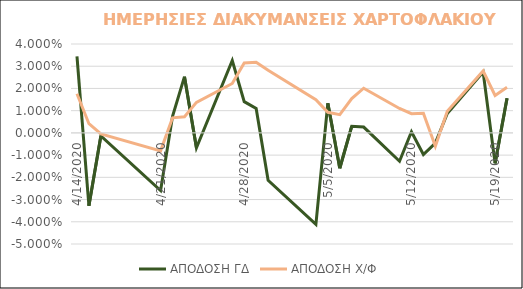
| Category | ΑΠΟΔΟΣΗ ΓΔ | ΑΠΟΔΟΣΗ Χ/Φ |
|---|---|---|
| 4/14/20 | 0.034 | 0.018 |
| 4/15/20 | -0.033 | 0.004 |
| 4/16/20 | -0.001 | 0 |
| 4/21/20 | -0.026 | -0.008 |
| 4/22/20 | 0.007 | 0.007 |
| 4/23/20 | 0.025 | 0.007 |
| 4/24/20 | -0.007 | 0.014 |
| 4/27/20 | 0.033 | 0.022 |
| 4/28/20 | 0.014 | 0.031 |
| 4/29/20 | 0.011 | 0.032 |
| 4/30/20 | -0.021 | 0.028 |
| 5/4/20 | -0.041 | 0.015 |
| 5/5/20 | 0.013 | 0.009 |
| 5/6/20 | -0.016 | 0.008 |
| 5/7/20 | 0.003 | 0.015 |
| 5/8/20 | 0.003 | 0.02 |
| 5/11/20 | -0.013 | 0.011 |
| 5/12/20 | 0.001 | 0.009 |
| 5/13/20 | -0.01 | 0.009 |
| 5/14/20 | -0.005 | -0.006 |
| 5/15/20 | 0.009 | 0.01 |
| 5/18/20 | 0.027 | 0.028 |
| 5/19/20 | -0.014 | 0.017 |
| 5/20/20 | 0.016 | 0.021 |